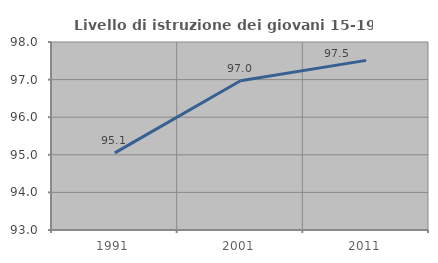
| Category | Livello di istruzione dei giovani 15-19 anni |
|---|---|
| 1991.0 | 95.052 |
| 2001.0 | 96.97 |
| 2011.0 | 97.511 |